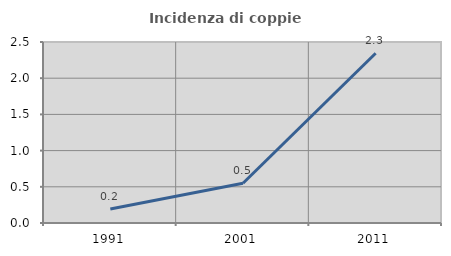
| Category | Incidenza di coppie miste |
|---|---|
| 1991.0 | 0.195 |
| 2001.0 | 0.548 |
| 2011.0 | 2.344 |